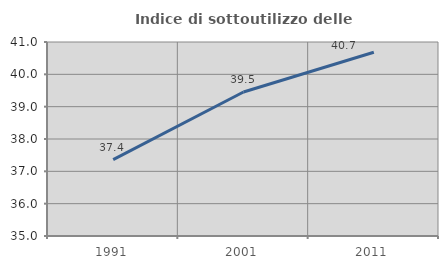
| Category | Indice di sottoutilizzo delle abitazioni  |
|---|---|
| 1991.0 | 37.36 |
| 2001.0 | 39.453 |
| 2011.0 | 40.684 |